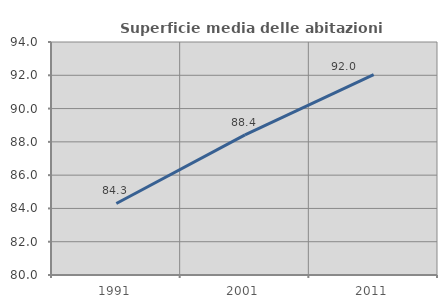
| Category | Superficie media delle abitazioni occupate |
|---|---|
| 1991.0 | 84.297 |
| 2001.0 | 88.418 |
| 2011.0 | 92.043 |